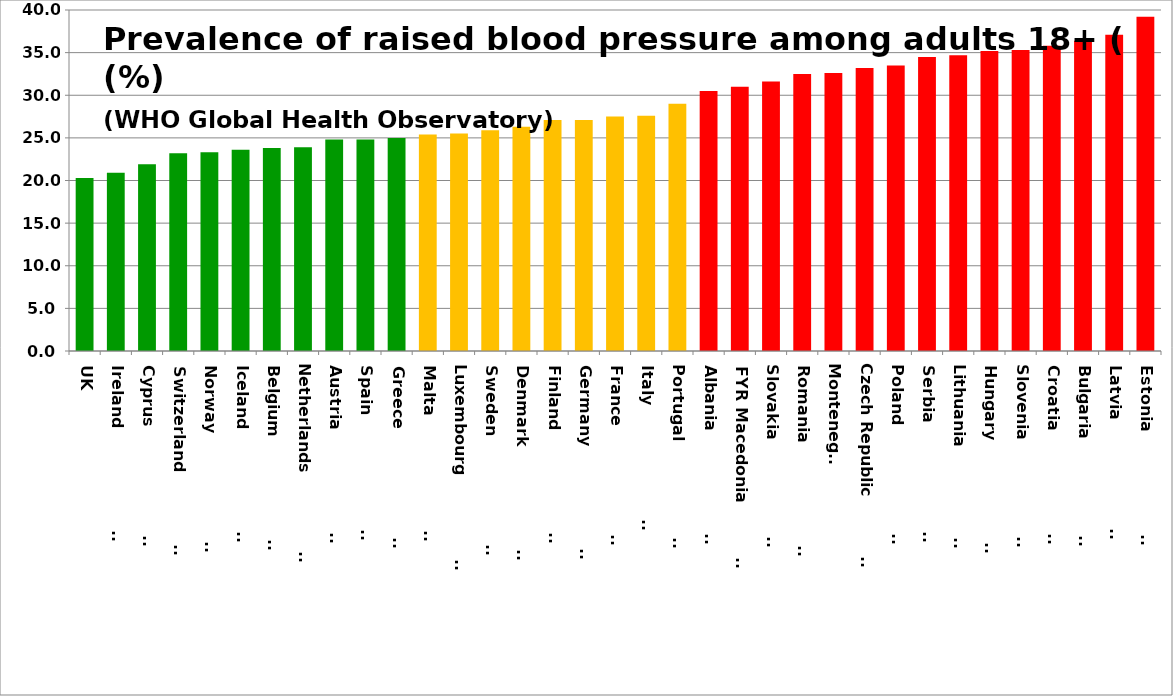
| Category | Series 0 |
|---|---|
| UK | 20.3 |
| Ireland                       | 20.9 |
| Cyprus                        | 21.9 |
| Switzerland                   | 23.2 |
| Norway                        | 23.3 |
| Iceland                       | 23.6 |
| Belgium                       | 23.8 |
| Netherlands                   | 23.9 |
| Austria                       | 24.8 |
| Spain                         | 24.8 |
| Greece                        | 25 |
| Malta                         | 25.4 |
| Luxembourg                    | 25.5 |
| Sweden                        | 25.9 |
| Denmark                       | 26.3 |
| Finland                       | 27.1 |
| Germany                       | 27.1 |
| France                        | 27.5 |
| Italy                         | 27.6 |
| Portugal                      | 29 |
| Albania                       | 30.5 |
| FYR Macedonia                | 31 |
| Slovakia                      | 31.6 |
| Romania                       | 32.5 |
| Montenegro | 32.6 |
| Czech Republic                | 33.2 |
| Poland                        | 33.5 |
| Serbia                        | 34.5 |
| Lithuania                     | 34.7 |
| Hungary                       | 35.2 |
| Slovenia                      | 35.3 |
| Croatia                       | 35.8 |
| Bulgaria                      | 36.4 |
| Latvia                        | 37.1 |
| Estonia                       | 39.2 |